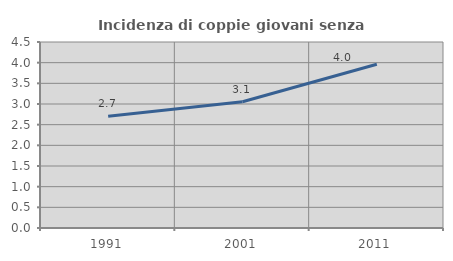
| Category | Incidenza di coppie giovani senza figli |
|---|---|
| 1991.0 | 2.703 |
| 2001.0 | 3.053 |
| 2011.0 | 3.96 |